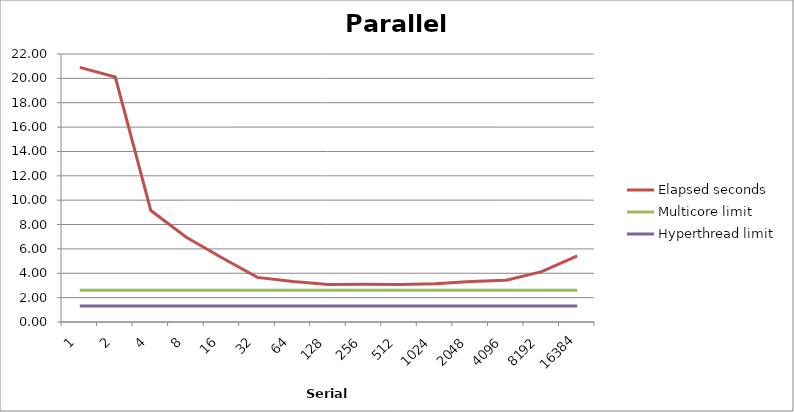
| Category | Elapsed seconds | Multicore limit | Hyperthread limit |
|---|---|---|---|
| 1.0 | 20.9 | 2.612 | 1.306 |
| 2.0 | 20.11 | 2.612 | 1.306 |
| 4.0 | 9.15 | 2.612 | 1.306 |
| 8.0 | 6.96 | 2.612 | 1.306 |
| 16.0 | 5.27 | 2.612 | 1.306 |
| 32.0 | 3.66 | 2.612 | 1.306 |
| 64.0 | 3.33 | 2.612 | 1.306 |
| 128.0 | 3.08 | 2.612 | 1.306 |
| 256.0 | 3.1 | 2.612 | 1.306 |
| 512.0 | 3.07 | 2.612 | 1.306 |
| 1024.0 | 3.13 | 2.612 | 1.306 |
| 2048.0 | 3.32 | 2.612 | 1.306 |
| 4096.0 | 3.43 | 2.612 | 1.306 |
| 8192.0 | 4.13 | 2.612 | 1.306 |
| 16384.0 | 5.42 | 2.612 | 1.306 |